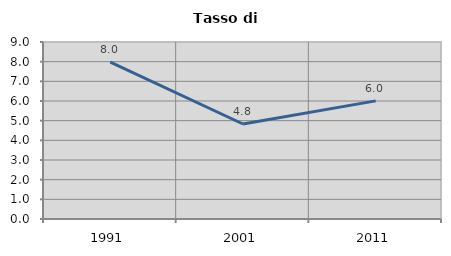
| Category | Tasso di disoccupazione   |
|---|---|
| 1991.0 | 7.973 |
| 2001.0 | 4.831 |
| 2011.0 | 6.007 |